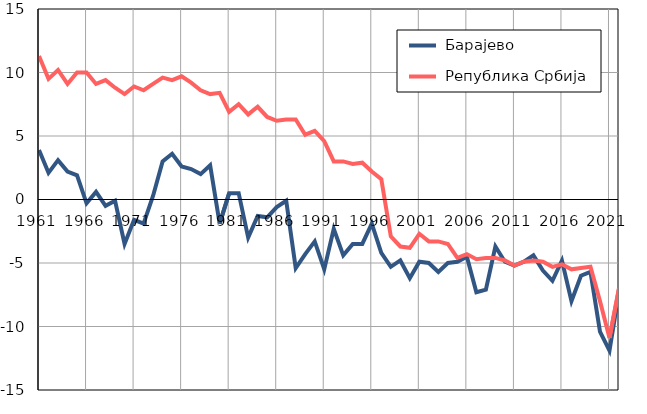
| Category |  Барајево |  Република Србија |
|---|---|---|
| 1961.0 | 3.9 | 11.3 |
| 1962.0 | 2.1 | 9.5 |
| 1963.0 | 3.1 | 10.2 |
| 1964.0 | 2.2 | 9.1 |
| 1965.0 | 1.9 | 10 |
| 1966.0 | -0.3 | 10 |
| 1967.0 | 0.6 | 9.1 |
| 1968.0 | -0.5 | 9.4 |
| 1969.0 | -0.1 | 8.8 |
| 1970.0 | -3.5 | 8.3 |
| 1971.0 | -1.6 | 8.9 |
| 1972.0 | -1.9 | 8.6 |
| 1973.0 | 0.3 | 9.1 |
| 1974.0 | 3 | 9.6 |
| 1975.0 | 3.6 | 9.4 |
| 1976.0 | 2.6 | 9.7 |
| 1977.0 | 2.4 | 9.2 |
| 1978.0 | 2 | 8.6 |
| 1979.0 | 2.7 | 8.3 |
| 1980.0 | -1.9 | 8.4 |
| 1981.0 | 0.5 | 6.9 |
| 1982.0 | 0.5 | 7.5 |
| 1983.0 | -3 | 6.7 |
| 1984.0 | -1.3 | 7.3 |
| 1985.0 | -1.4 | 6.5 |
| 1986.0 | -0.6 | 6.2 |
| 1987.0 | -0.1 | 6.3 |
| 1988.0 | -5.4 | 6.3 |
| 1989.0 | -4.3 | 5.1 |
| 1990.0 | -3.3 | 5.4 |
| 1991.0 | -5.5 | 4.6 |
| 1992.0 | -2.3 | 3 |
| 1993.0 | -4.4 | 3 |
| 1994.0 | -3.5 | 2.8 |
| 1995.0 | -3.5 | 2.9 |
| 1996.0 | -1.9 | 2.2 |
| 1997.0 | -4.2 | 1.6 |
| 1998.0 | -5.3 | -2.9 |
| 1999.0 | -4.8 | -3.7 |
| 2000.0 | -6.2 | -3.8 |
| 2001.0 | -4.9 | -2.7 |
| 2002.0 | -5 | -3.3 |
| 2003.0 | -5.7 | -3.3 |
| 2004.0 | -5 | -3.5 |
| 2005.0 | -4.9 | -4.6 |
| 2006.0 | -4.5 | -4.3 |
| 2007.0 | -7.3 | -4.7 |
| 2008.0 | -7.1 | -4.6 |
| 2009.0 | -3.7 | -4.6 |
| 2010.0 | -4.9 | -4.8 |
| 2011.0 | -5.2 | -5.2 |
| 2012.0 | -4.9 | -4.9 |
| 2013.0 | -4.4 | -4.8 |
| 2014.0 | -5.6 | -4.9 |
| 2015.0 | -6.4 | -5.3 |
| 2016.0 | -4.8 | -5.1 |
| 2017.0 | -8 | -5.5 |
| 2018.0 | -6 | -5.4 |
| 2019.0 | -5.7 | -5.3 |
| 2020.0 | -10.4 | -8 |
| 2021.0 | -11.9 | -10.9 |
| 2022.0 | -7.3 | -7 |